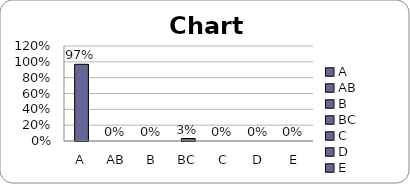
| Category | Series 0 |
|---|---|
| A | 0.969 |
| AB | 0 |
| B | 0 |
| BC | 0.031 |
| C | 0 |
| D | 0 |
| E | 0 |